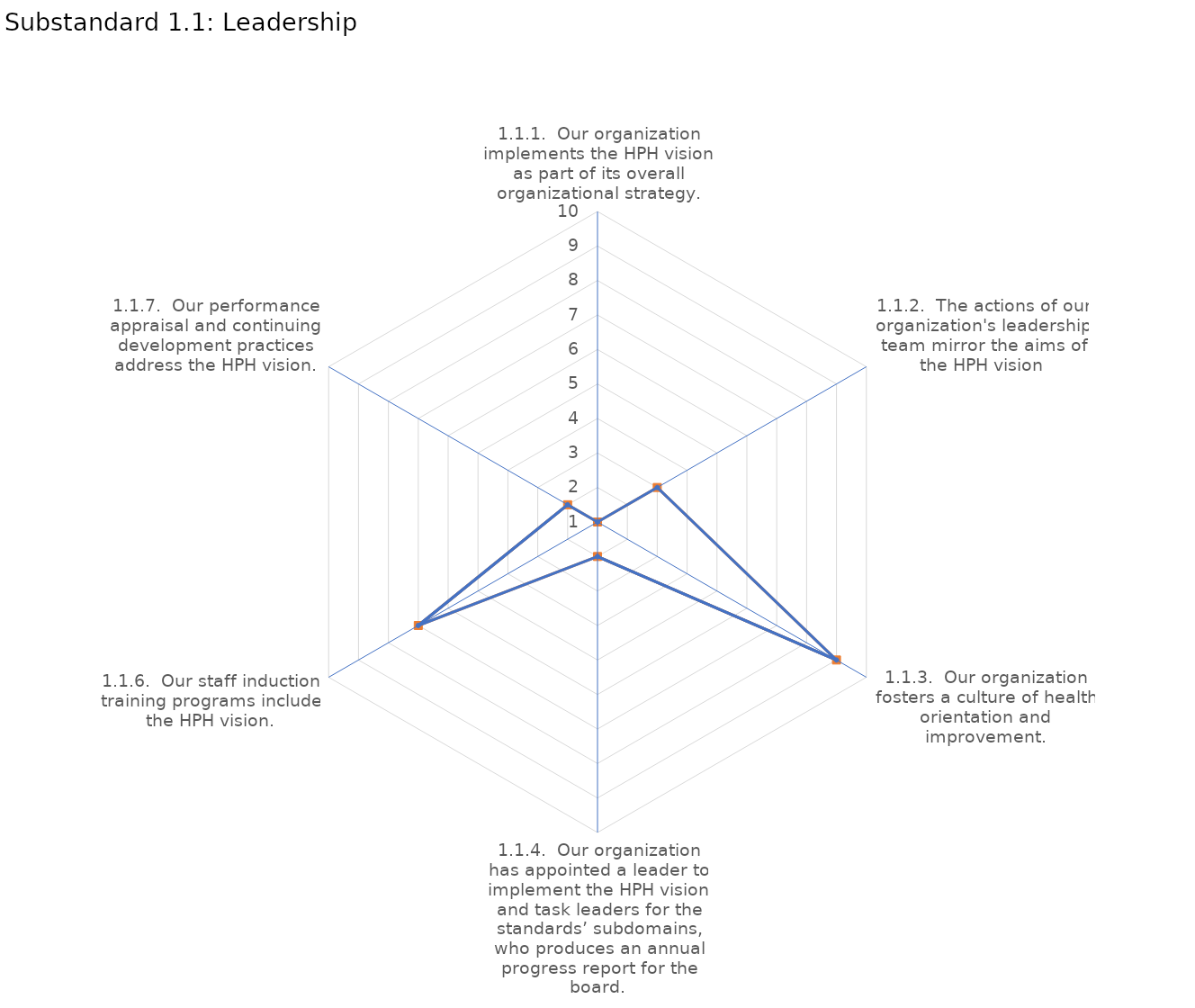
| Category | value |
|---|---|
| 1.1.1.  Our organization implements the HPH vision as part of its overall organizational strategy. | 1 |
| 1.1.2.  The actions of our organization's leadership team mirror the aims of the HPH vision | 3 |
| 1.1.3.  Our organization fosters a culture of health orientation and improvement. | 9 |
| 1.1.4.  Our organization has appointed a leader to implement the HPH vision and task leaders for the standards’ subdomains, who produces an annual progress report for the board. | 2 |
| 1.1.6.  Our staff induction training programs include the HPH vision. | 7 |
| 1.1.7.  Our performance appraisal and continuing development practices address the HPH vision. | 2 |